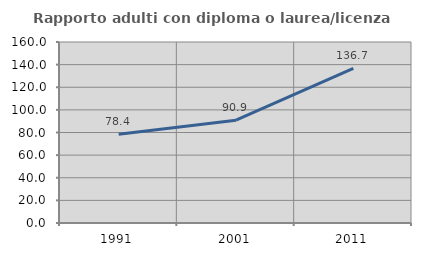
| Category | Rapporto adulti con diploma o laurea/licenza media  |
|---|---|
| 1991.0 | 78.409 |
| 2001.0 | 90.909 |
| 2011.0 | 136.667 |